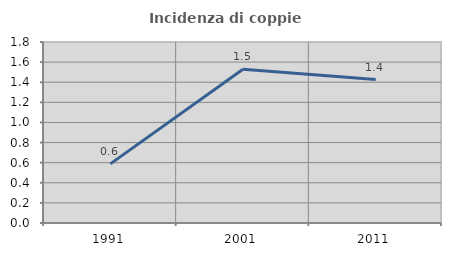
| Category | Incidenza di coppie miste |
|---|---|
| 1991.0 | 0.588 |
| 2001.0 | 1.529 |
| 2011.0 | 1.426 |